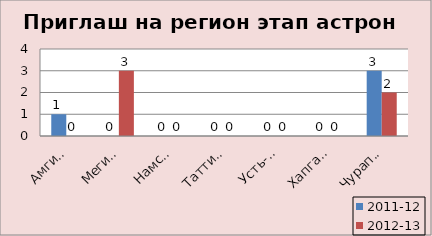
| Category | 2011-12 | 2012-13 |
|---|---|---|
| Амгинский | 1 | 0 |
| Мегино-Кангаласс | 0 | 3 |
| Намский | 0 | 0 |
| Таттинский | 0 | 0 |
| Усть-Алданский | 0 | 0 |
| Хапгаласский | 0 | 0 |
| Чурапчинский | 3 | 2 |